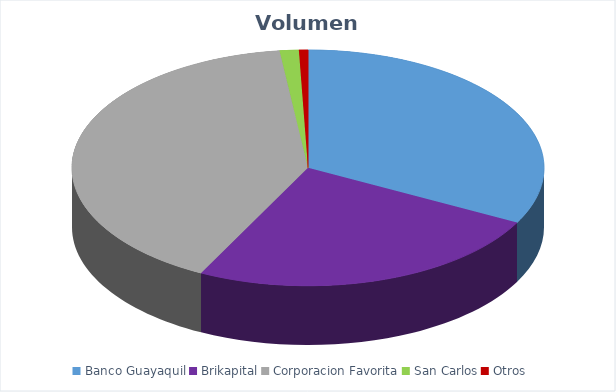
| Category | VOLUMEN ($USD) |
|---|---|
| Banco Guayaquil | 26376.3 |
| Brikapital | 20000 |
| Corporacion Favorita | 32752.31 |
| San Carlos | 1056.25 |
| Otros | 495.8 |